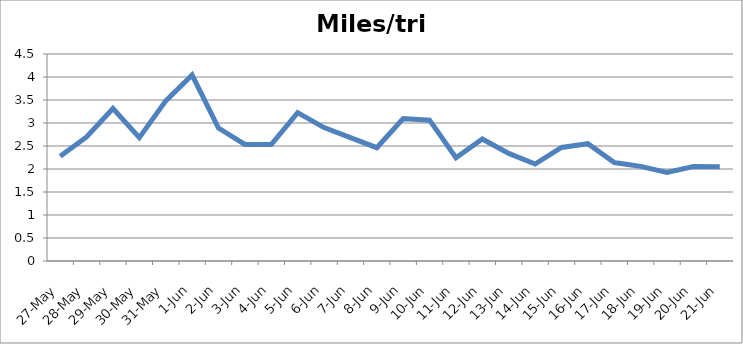
| Category | Miles/trip |
|---|---|
| 2013-05-27 | 2.276 |
| 2013-05-28 | 2.698 |
| 2013-05-29 | 3.314 |
| 2013-05-30 | 2.682 |
| 2013-05-31 | 3.481 |
| 2013-06-01 | 4.043 |
| 2013-06-02 | 2.89 |
| 2013-06-03 | 2.533 |
| 2013-06-04 | 2.531 |
| 2013-06-05 | 3.225 |
| 2013-06-06 | 2.9 |
| 2013-06-07 | 2.681 |
| 2013-06-08 | 2.463 |
| 2013-06-09 | 3.097 |
| 2013-06-10 | 3.062 |
| 2013-06-11 | 2.245 |
| 2013-06-12 | 2.653 |
| 2013-06-13 | 2.339 |
| 2013-06-14 | 2.109 |
| 2013-06-15 | 2.467 |
| 2013-06-16 | 2.55 |
| 2013-06-17 | 2.14 |
| 2013-06-18 | 2.058 |
| 2013-06-19 | 1.928 |
| 2013-06-20 | 2.052 |
| 2013-06-21 | 2.047 |